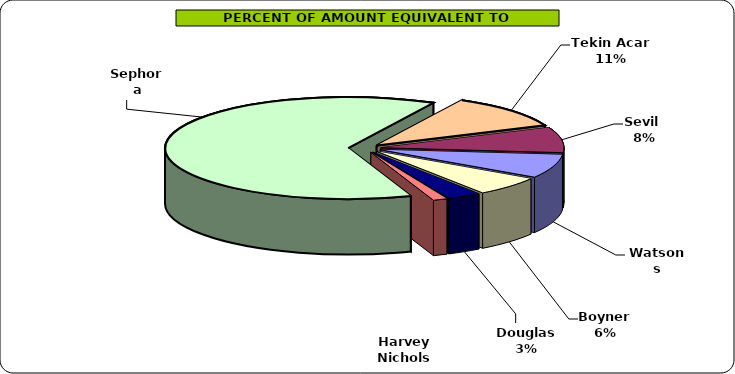
| Category | Series 0 |
|---|---|
| Sephora | 1321650.472 |
| Tekin Acar  | 225897.359 |
| Sevil  | 168100.088 |
| Watsons | 156221.396 |
| Boyner | 127980.274 |
| Douglas  | 63105.013 |
| Harvey Nichols | 26386.696 |